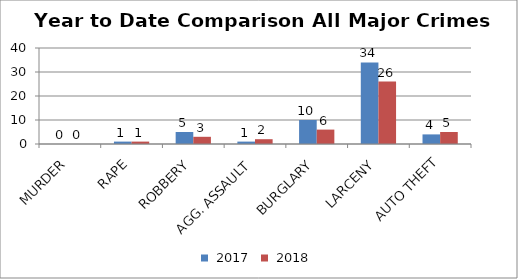
| Category | Series 0 | Series 1 |
|---|---|---|
| MURDER | 0 | 0 |
| RAPE | 1 | 1 |
| ROBBERY | 5 | 3 |
| AGG. ASSAULT | 1 | 2 |
| BURGLARY | 10 | 6 |
| LARCENY | 34 | 26 |
| AUTO THEFT | 4 | 5 |